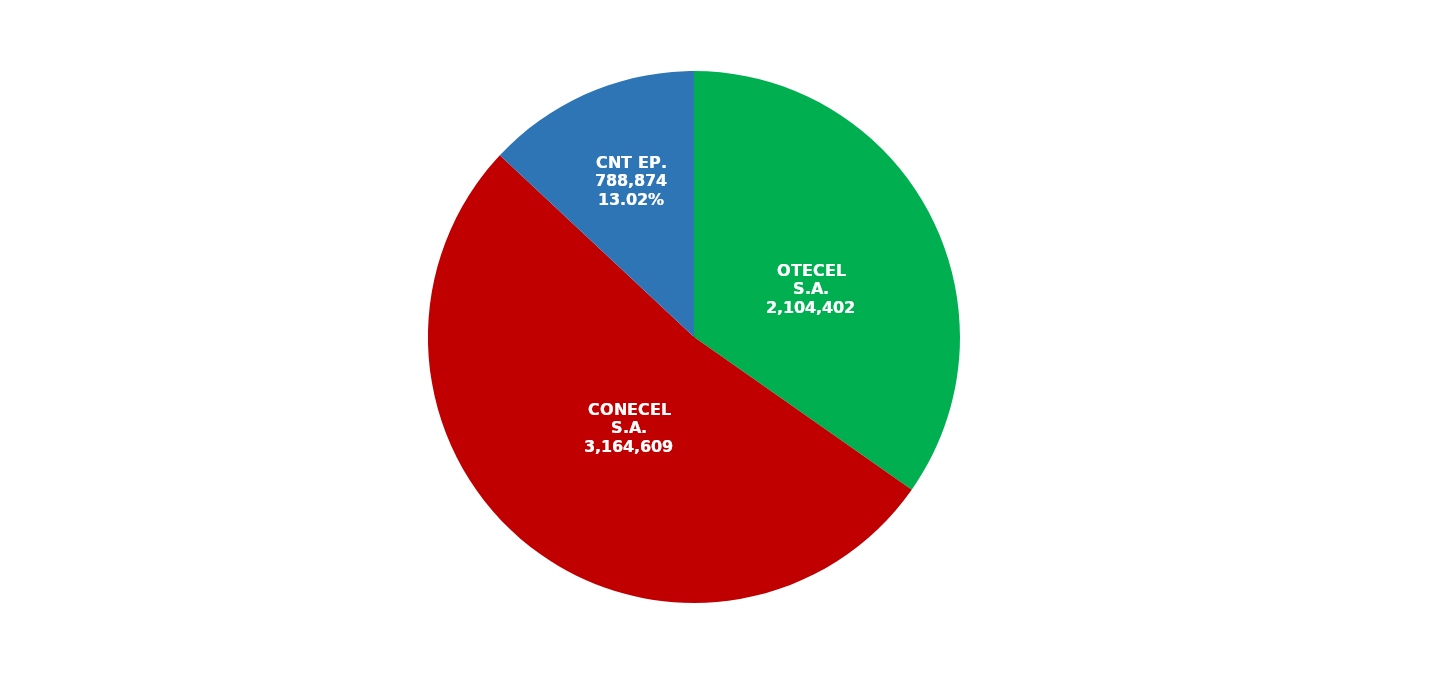
| Category | Series 0 |
|---|---|
| OTECEL S.A. | 2104402 |
| CONECEL S.A. | 3164609 |
| CNT EP. | 788874 |